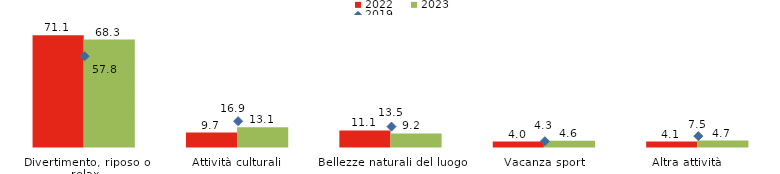
| Category | 2022 | 2023 |
|---|---|---|
| Divertimento, riposo o relax | 71.092 | 68.3 |
| Attività culturali | 9.731 | 13.1 |
| Bellezze naturali del luogo | 11.073 | 9.2 |
| Vacanza sport | 4.024 | 4.6 |
| Altra attività       | 4.083 | 4.7 |